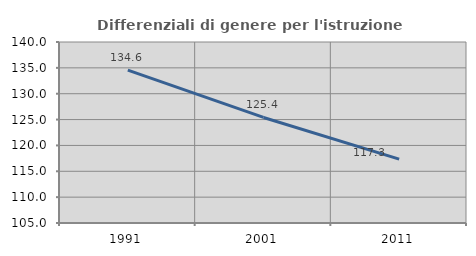
| Category | Differenziali di genere per l'istruzione superiore |
|---|---|
| 1991.0 | 134.563 |
| 2001.0 | 125.412 |
| 2011.0 | 117.34 |